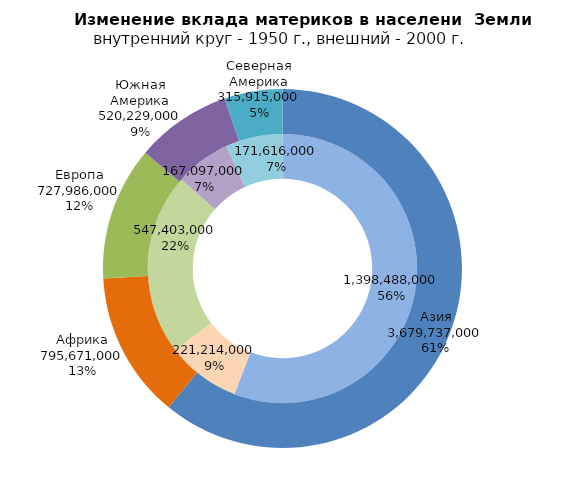
| Category | 1950 г. | 2000 г. |
|---|---|---|
| Азия | 1398488000 | 3679737000 |
| Африка | 221214000 | 795671000 |
| Европа | 547403000 | 727986000 |
| Южная Америка | 167097000 | 520229000 |
| Северная Америка | 171616000 | 315915000 |